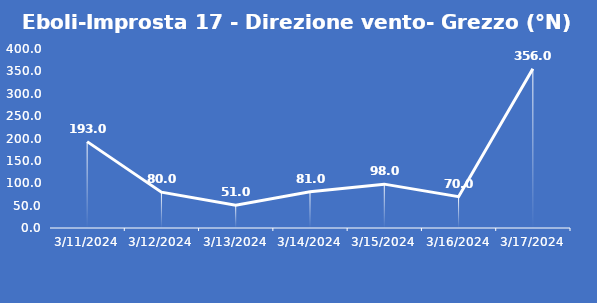
| Category | Eboli-Improsta 17 - Direzione vento- Grezzo (°N) |
|---|---|
| 3/11/24 | 193 |
| 3/12/24 | 80 |
| 3/13/24 | 51 |
| 3/14/24 | 81 |
| 3/15/24 | 98 |
| 3/16/24 | 70 |
| 3/17/24 | 356 |